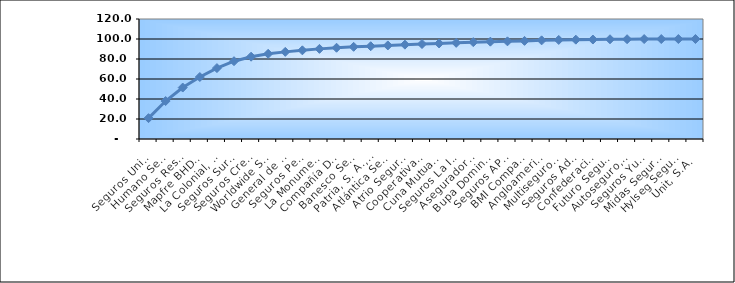
| Category | Series 0 |
|---|---|
| Seguros Universal, S. A. | 20.85 |
| Humano Seguros, S. A. | 37.957 |
| Seguros Reservas, S. A. | 51.459 |
| Mapfre BHD Compañía de Seguros | 61.976 |
| La Colonial, S. A., Compañia De Seguros | 70.892 |
| Seguros Sura, S.A. | 77.81 |
| Seguros Crecer, S. A. | 82.306 |
| Worldwide Seguros, S. A. | 85.181 |
| General de Seguros, S. A. | 87.128 |
| Seguros Pepín, S. A. | 88.656 |
| La Monumental de Seguros, S. A. | 90.128 |
| Compañía Dominicana de Seguros, C. por A. | 91.259 |
| Banesco Seguros | 92.178 |
| Patria, S. A., Compañía de Seguros | 92.766 |
| Atlántica Seguros, S. A. | 93.563 |
| Atrio Seguros S. A. | 94.358 |
| Cooperativa Nacional De Seguros, Inc  | 94.973 |
| Cuna Mutual Insurance Society Dominicana | 95.537 |
| Seguros La Internacional, S. A. | 96.153 |
| Aseguradora Agropecuaria Dominicana, S. A. | 96.856 |
| Bupa Dominicana, S. A. | 97.35 |
| Seguros APS, S.R.L. | 97.667 |
| BMI Compañía de Seguros, S. A. | 98.122 |
| Angloamericana de Seguros, S. A. | 98.64 |
| Multiseguros Su, S.A. | 99.062 |
| Seguros Ademi, S.A. | 99.33 |
| Confederación del Canadá Dominicana, S. A. | 99.465 |
| Futuro Seguros | 99.738 |
| Autoseguro, S. A. | 99.794 |
| Seguros Yunen, S.A. | 99.93 |
| Midas Seguros, S.A. | 99.953 |
| Hylseg Seguros S.A | 99.964 |
| Unit, S.A. | 100 |